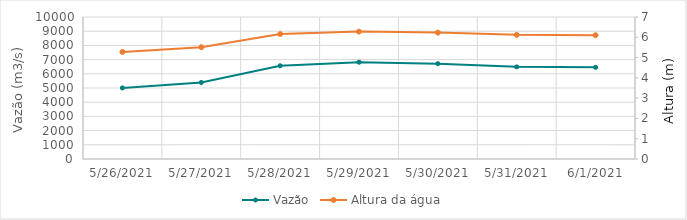
| Category | Vazão |
|---|---|
| 5/25/21 | 5074.41 |
| 5/24/21 | 5110.52 |
| 5/23/21 | 5273.06 |
| 5/22/21 | 5391.71 |
| 5/21/21 | 5215.78 |
| 5/20/21 | 5161.1 |
| 5/19/21 | 5005.58 |